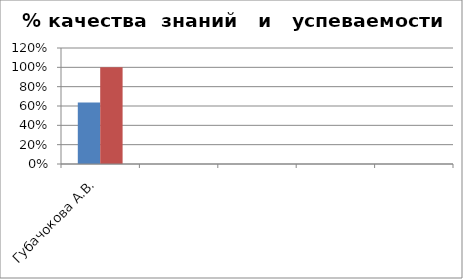
| Category | Series 0 | 2 |
|---|---|---|
| Губачокова А.В. | 0.637 | 1 |